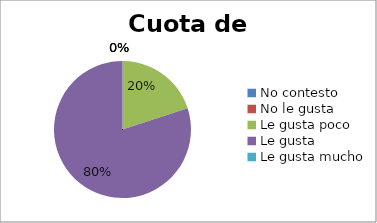
| Category | Series 0 |
|---|---|
| No contesto | 0 |
| No le gusta | 0 |
| Le gusta poco | 1 |
| Le gusta | 4 |
| Le gusta mucho | 0 |